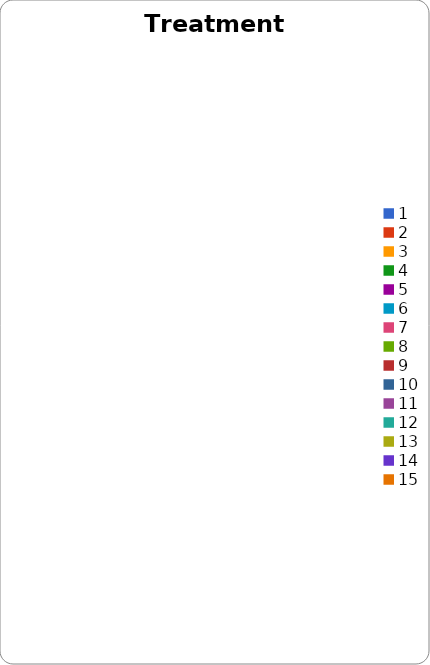
| Category | Series 0 |
|---|---|
| 0 | 0 |
| 1 | 0 |
| 2 | 0 |
| 3 | 0 |
| 4 | 0 |
| 5 | 0 |
| 6 | 0 |
| 7 | 0 |
| 8 | 0 |
| 9 | 0 |
| 10 | 0 |
| 11 | 0 |
| 12 | 0 |
| 13 | 0 |
| 14 | 0 |